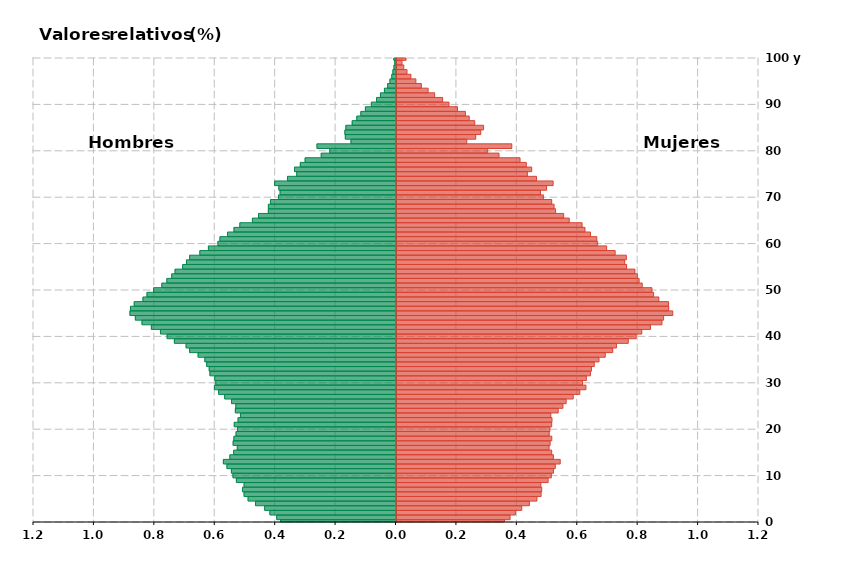
| Category | Hombres | Mujeres |
|---|---|---|
| 0 | -0.382 | 0.358 |
| 1 | -0.395 | 0.376 |
| 2 | -0.417 | 0.394 |
| 3 | -0.435 | 0.415 |
| 4 | -0.465 | 0.44 |
| 5 | -0.49 | 0.465 |
| 6 | -0.503 | 0.479 |
| 7 | -0.508 | 0.481 |
| 8 | -0.503 | 0.478 |
| 9 | -0.528 | 0.502 |
| 10 | -0.54 | 0.512 |
| 11 | -0.545 | 0.52 |
| 12 | -0.56 | 0.526 |
| 13 | -0.571 | 0.542 |
| 14 | -0.55 | 0.519 |
| 15 | -0.537 | 0.514 |
| 16 | -0.525 | 0.505 |
| 17 | -0.539 | 0.509 |
| 18 | -0.537 | 0.514 |
| 19 | -0.529 | 0.506 |
| 20 | -0.524 | 0.508 |
| 21 | -0.535 | 0.514 |
| 22 | -0.523 | 0.515 |
| 23 | -0.515 | 0.511 |
| 24 | -0.532 | 0.535 |
| 25 | -0.53 | 0.551 |
| 26 | -0.544 | 0.562 |
| 27 | -0.567 | 0.585 |
| 28 | -0.587 | 0.607 |
| 29 | -0.601 | 0.627 |
| 30 | -0.597 | 0.616 |
| 31 | -0.6 | 0.629 |
| 32 | -0.616 | 0.642 |
| 33 | -0.618 | 0.645 |
| 34 | -0.627 | 0.655 |
| 35 | -0.633 | 0.67 |
| 36 | -0.655 | 0.691 |
| 37 | -0.683 | 0.716 |
| 38 | -0.695 | 0.728 |
| 39 | -0.734 | 0.767 |
| 40 | -0.758 | 0.793 |
| 41 | -0.78 | 0.812 |
| 42 | -0.81 | 0.841 |
| 43 | -0.841 | 0.879 |
| 44 | -0.863 | 0.884 |
| 45 | -0.881 | 0.915 |
| 46 | -0.879 | 0.901 |
| 47 | -0.867 | 0.901 |
| 48 | -0.838 | 0.868 |
| 49 | -0.824 | 0.851 |
| 50 | -0.802 | 0.846 |
| 51 | -0.775 | 0.813 |
| 52 | -0.758 | 0.803 |
| 53 | -0.742 | 0.797 |
| 54 | -0.731 | 0.789 |
| 55 | -0.706 | 0.762 |
| 56 | -0.694 | 0.755 |
| 57 | -0.683 | 0.761 |
| 58 | -0.649 | 0.724 |
| 59 | -0.621 | 0.696 |
| 60 | -0.589 | 0.666 |
| 61 | -0.583 | 0.663 |
| 62 | -0.558 | 0.642 |
| 63 | -0.536 | 0.624 |
| 64 | -0.517 | 0.614 |
| 65 | -0.475 | 0.572 |
| 66 | -0.455 | 0.553 |
| 67 | -0.423 | 0.527 |
| 68 | -0.422 | 0.522 |
| 69 | -0.416 | 0.514 |
| 70 | -0.389 | 0.486 |
| 71 | -0.384 | 0.477 |
| 72 | -0.388 | 0.497 |
| 73 | -0.402 | 0.518 |
| 74 | -0.359 | 0.464 |
| 75 | -0.329 | 0.433 |
| 76 | -0.336 | 0.448 |
| 77 | -0.317 | 0.43 |
| 78 | -0.301 | 0.409 |
| 79 | -0.247 | 0.339 |
| 80 | -0.219 | 0.302 |
| 81 | -0.262 | 0.382 |
| 82 | -0.149 | 0.233 |
| 83 | -0.168 | 0.262 |
| 84 | -0.169 | 0.279 |
| 85 | -0.166 | 0.288 |
| 86 | -0.145 | 0.259 |
| 87 | -0.13 | 0.241 |
| 88 | -0.116 | 0.228 |
| 89 | -0.101 | 0.202 |
| 90 | -0.082 | 0.174 |
| 91 | -0.064 | 0.153 |
| 92 | -0.051 | 0.126 |
| 93 | -0.038 | 0.105 |
| 94 | -0.028 | 0.082 |
| 95 | -0.02 | 0.064 |
| 96 | -0.014 | 0.048 |
| 97 | -0.01 | 0.035 |
| 98 | -0.007 | 0.024 |
| 99 | -0.004 | 0.018 |
| 100 | -0.007 | 0.032 |